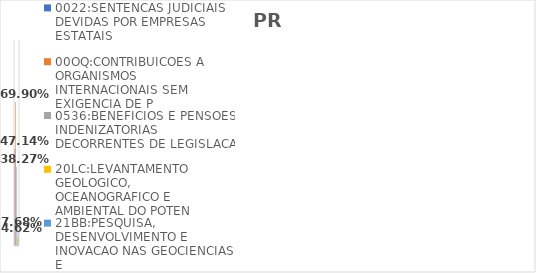
| Category | 0022:SENTENCAS JUDICIAIS DEVIDAS POR EMPRESAS ESTATAIS | 00OQ:CONTRIBUICOES A ORGANISMOS INTERNACIONAIS SEM EXIGENCIA DE P | 0536:BENEFICIOS E PENSOES INDENIZATORIAS DECORRENTES DE LEGISLACA | 20LC:LEVANTAMENTO GEOLOGICO, OCEANOGRAFICO E AMBIENTAL DO POTEN | 21BB:PESQUISA, DESENVOLVIMENTO E INOVACAO NAS GEOCIENCIAS E |
|---|---|---|---|---|---|
| EXECUTADO | 0.471 | 0.699 | 0.383 | 0.046 | 0.077 |